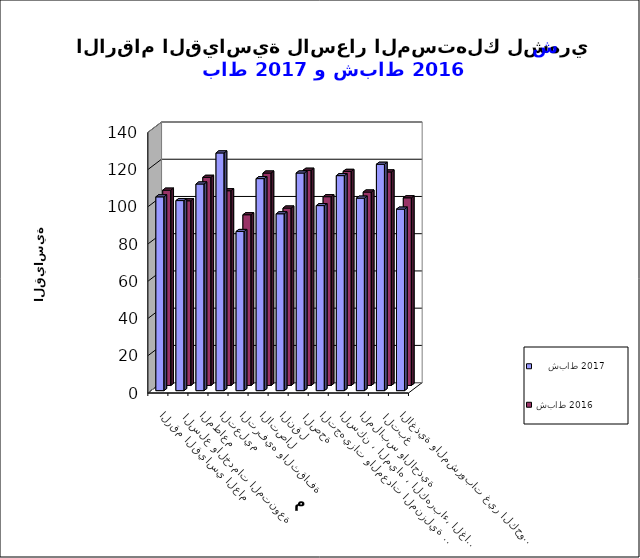
| Category |     شباط 2017      | شباط 2016 |
|---|---|---|
| الاغذية والمشروبات غير الكحولية | 97.5 | 100.8 |
|  التبغ | 121.6 | 114.7 |
| الملابس والاحذية | 103.4 | 103.9 |
| السكن ، المياه ، الكهرباء، الغاز  | 115.5 | 115 |
| التجهيزات والمعدات المنزلية والصيانة | 99.4 | 101.4 |
|  الصحة | 116.9 | 115.6 |
| النقل | 95 | 95.3 |
| الاتصال | 113.9 | 114.1 |
| الترفيه والثقافة | 85.5 | 91.7 |
| التعليم | 127.7 | 104.6 |
| المطاعم  | 111 | 111.8 |
|  السلع والخدمات المتنوعة | 102.1 | 99.2 |
| الرقم القياسي العام | 104.1 | 104.9 |